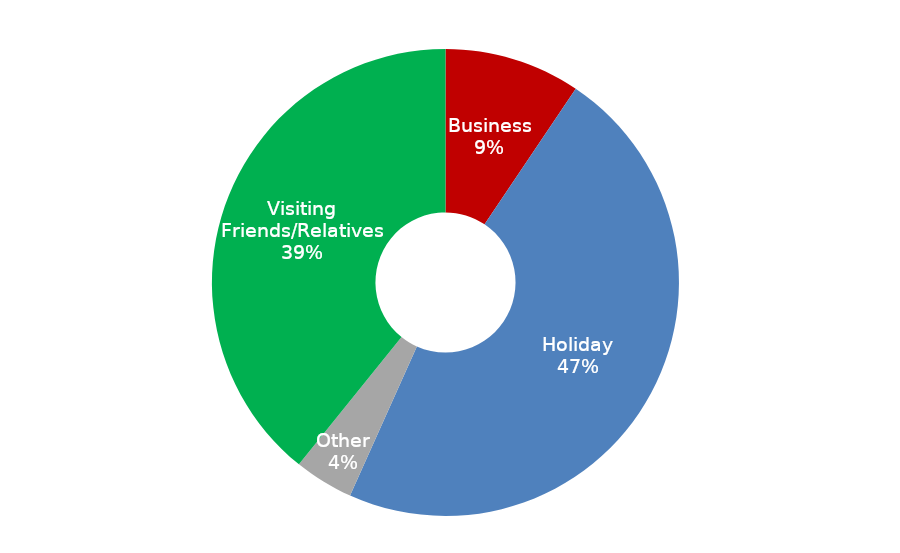
| Category | April 2016 - March 2017 |
|---|---|
| Business | 436300.891 |
| Holiday | 2190624.575 |
| Other | 189784.306 |
| Visiting Friends/Relatives | 1816142.659 |